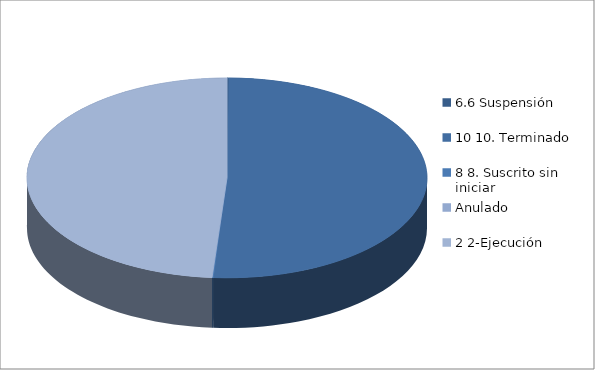
| Category | Series 0 |
|---|---|
| 6.6 Suspensión | 1 |
| 10 10. Terminado | 385 |
| 8 8. Suscrito sin iniciar | 1 |
| Anulado | 0 |
| 2 2-Ejecución | 369 |